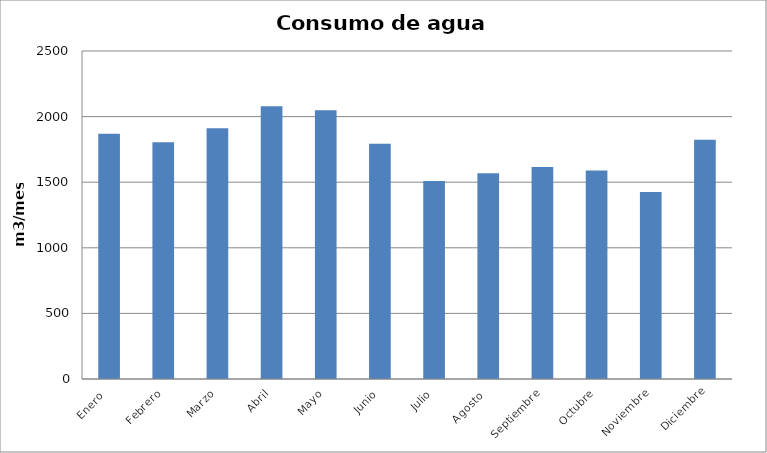
| Category | Series 0 |
|---|---|
| Enero  | 1869 |
| Febrero | 1804 |
| Marzo | 1912 |
| Abril | 2079 |
| Mayo | 2048 |
| Junio | 1793 |
| Julio | 1510 |
| Agosto  | 1569 |
| Septiembre | 1615 |
| Octubre | 1590 |
| Noviembre | 1426 |
| Diciembre | 1823 |